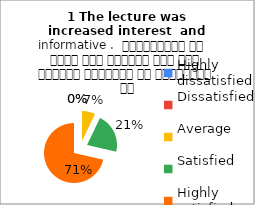
| Category | 1 The lecture was
increased interest  and informative .  व्याख्यान से रुचि में वृद्धि हुई एवं शिक्षण जानकारी से परिपूर्ण था |
|---|---|
| Highly dissatisfied | 0 |
| Dissatisfied | 0 |
| Average | 1 |
| Satisfied | 3 |
| Highly satisfied | 10 |